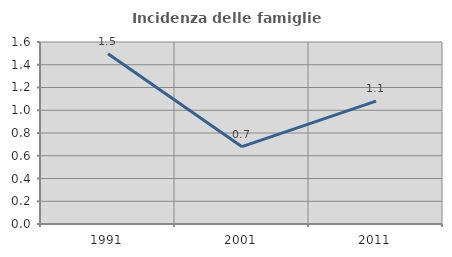
| Category | Incidenza delle famiglie numerose |
|---|---|
| 1991.0 | 1.497 |
| 2001.0 | 0.68 |
| 2011.0 | 1.08 |